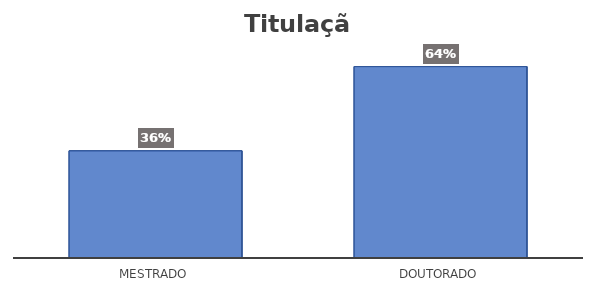
| Category | Series 0 |
|---|---|
| Mestrado | 0.359 |
| Doutorado | 0.641 |